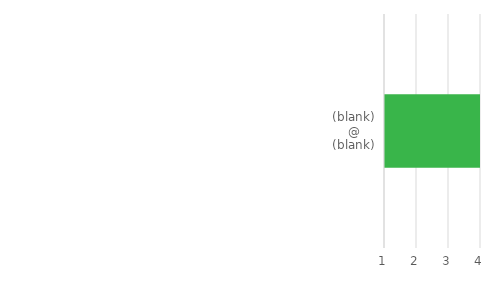
| Category | Summa |
|---|---|
| (blank) @ (blank) | 9 |